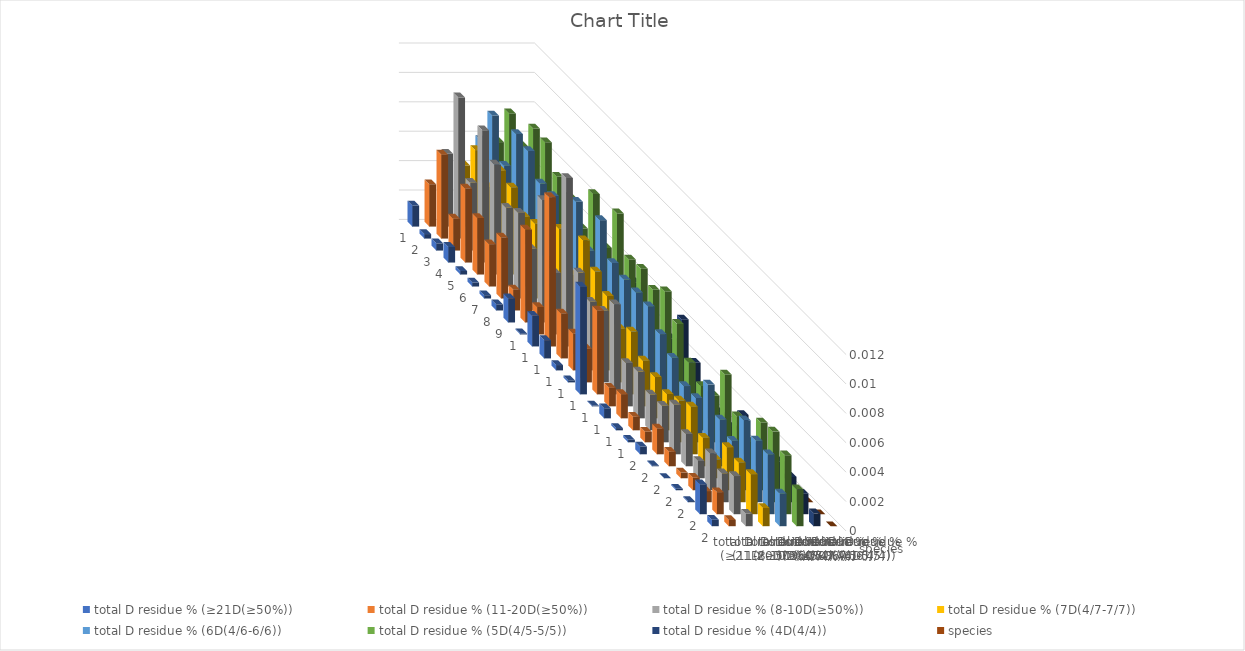
| Category | total D residue % (≥21D(≥50%)) | total D residue % (11-20D(≥50%)) | total D residue % (8-10D(≥50%)) | total D residue % (7D(4/7-7/7)) | total D residue % (6D(4/6-6/6)) | total D residue % (5D(4/5-5/5)) | total D residue % (4D(4/4)) | species |
|---|---|---|---|---|---|---|---|---|
| 0 | 0.001 | 0.003 | 0.005 | 0.004 | 0.006 | 0.006 | 0.002 | 0 |
| 1 | 0 | 0.006 | 0.01 | 0.006 | 0.008 | 0.009 | 0.004 | 0 |
| 2 | 0 | 0.002 | 0.005 | 0.004 | 0.006 | 0.007 | 0.003 | 0 |
| 3 | 0.001 | 0.005 | 0.009 | 0.006 | 0.009 | 0.009 | 0.004 | 0 |
| 4 | 0 | 0.004 | 0.007 | 0.006 | 0.008 | 0.009 | 0.004 | 0 |
| 5 | 0 | 0.003 | 0.005 | 0.005 | 0.007 | 0.007 | 0.003 | 0 |
| 6 | 0 | 0.004 | 0.006 | 0.005 | 0.007 | 0.007 | 0.003 | 0 |
| 7 | 0 | 0.001 | 0.004 | 0.003 | 0.005 | 0.006 | 0.002 | 0 |
| 8 | 0.002 | 0.006 | 0.008 | 0.006 | 0.008 | 0.009 | 0.003 | 0 |
| 9 | 0 | 0.002 | 0.004 | 0.004 | 0.006 | 0.006 | 0.002 | 0 |
| 10 | 0.002 | 0.01 | 0.011 | 0.007 | 0.009 | 0.009 | 0.004 | 0 |
| 11 | 0.001 | 0.003 | 0.006 | 0.006 | 0.006 | 0.007 | 0.003 | 0 |
| 12 | 0 | 0.003 | 0.005 | 0.005 | 0.006 | 0.007 | 0.002 | 0 |
| 13 | 0 | 0.002 | 0.005 | 0.004 | 0.006 | 0.006 | 0.003 | 0 |
| 14 | 0.007 | 0.006 | 0.006 | 0.004 | 0.006 | 0.007 | 0.005 | 0 |
| 15 | 0 | 0.001 | 0.003 | 0.003 | 0.005 | 0.006 | 0.003 | 0 |
| 16 | 0.001 | 0.002 | 0.003 | 0.003 | 0.004 | 0.004 | 0.002 | 0 |
| 17 | 0 | 0.001 | 0.002 | 0.002 | 0.003 | 0.003 | 0.001 | 0 |
| 18 | 0 | 0.001 | 0.002 | 0.003 | 0.003 | 0.003 | 0.001 | 0 |
| 19 | 0.001 | 0.002 | 0.003 | 0.003 | 0.005 | 0.005 | 0.003 | 0 |
| 20 | 0 | 0.001 | 0.002 | 0.002 | 0.003 | 0.003 | 0.001 | 0 |
| 21 | 0 | 0 | 0.001 | 0.001 | 0.003 | 0.002 | 0.001 | 0 |
| 22 | 0 | 0.001 | 0.003 | 0.003 | 0.005 | 0.005 | 0.002 | 0 |
| 23 | 0 | 0.001 | 0.002 | 0.003 | 0.004 | 0.005 | 0.002 | 0 |
| 24 | 0.002 | 0.001 | 0.003 | 0.003 | 0.004 | 0.004 | 0.001 | 0 |
| 25 | 0 | 0 | 0.001 | 0.001 | 0.002 | 0.003 | 0.001 | 0 |